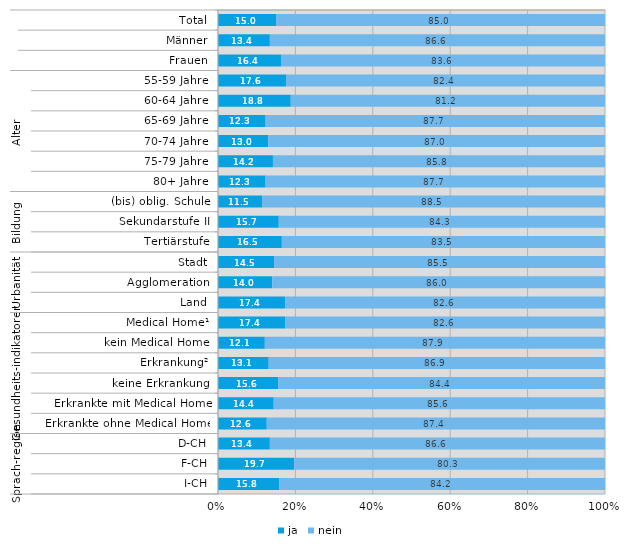
| Category | ja | nein |
|---|---|---|
| 0 | 15 | 85 |
| 1 | 13.4 | 86.6 |
| 2 | 16.4 | 83.6 |
| 3 | 17.6 | 82.4 |
| 4 | 18.8 | 81.2 |
| 5 | 12.3 | 87.7 |
| 6 | 13 | 87 |
| 7 | 14.2 | 85.8 |
| 8 | 12.3 | 87.7 |
| 9 | 11.5 | 88.5 |
| 10 | 15.7 | 84.3 |
| 11 | 16.5 | 83.5 |
| 12 | 14.5 | 85.5 |
| 13 | 14 | 86 |
| 14 | 17.4 | 82.6 |
| 15 | 17.4 | 82.6 |
| 16 | 12.1 | 87.9 |
| 17 | 13.1 | 86.9 |
| 18 | 15.6 | 84.4 |
| 19 | 14.4 | 85.6 |
| 20 | 12.6 | 87.4 |
| 21 | 13.4 | 86.6 |
| 22 | 19.7 | 80.3 |
| 23 | 15.8 | 84.2 |